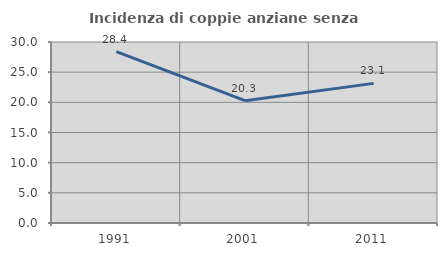
| Category | Incidenza di coppie anziane senza figli  |
|---|---|
| 1991.0 | 28.409 |
| 2001.0 | 20.28 |
| 2011.0 | 23.14 |